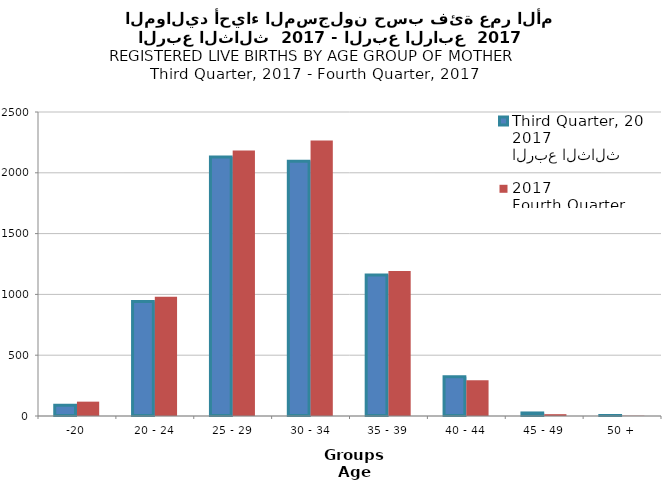
| Category | الربع الثالث 2017
Third Quarter, 2017 | الربع الرابع 2017
Fourth Quarter, 2017 |
|---|---|---|
| -20 | 89 | 118 |
| 20 - 24 | 942 | 981 |
| 25 - 29 | 2129 | 2183 |
| 30 - 34 | 2094 | 2266 |
| 35 - 39 | 1160 | 1193 |
| 40 - 44 | 323 | 294 |
| 45 - 49 | 25 | 15 |
| 50 + | 4 | 2 |